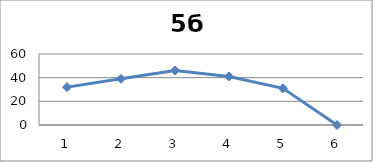
| Category | Series 0 |
|---|---|
| 0 | 32 |
| 1 | 39 |
| 2 | 46 |
| 3 | 41 |
| 4 | 31 |
| 5 | 0 |